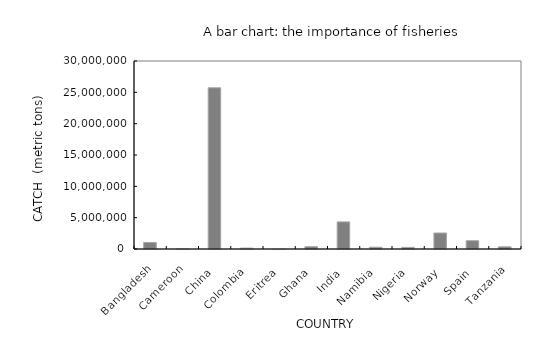
| Category | Total fish catch (MT) |
|---|---|
| Bangladesh | 1047170 |
| Cameroon | 80000 |
| China | 25721740 |
| Colombia | 146407 |
| Eritrea | 3826 |
| Ghana | 371227 |
| India | 4324235 |
| Namibia | 285980 |
| Nigeria | 255499 |
| Norway | 2550894 |
| Spain | 1320000 |
| Tanzania | 345000 |